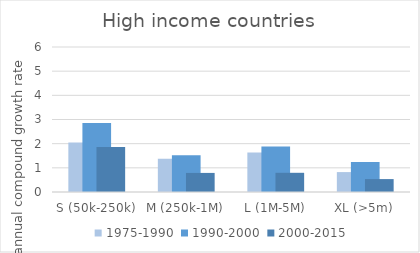
| Category | 1975-1990 | 1990-2000 | 2000-2015 |
|---|---|---|---|
| S (50k-250k) | 2.044 | 2.855 | 1.863 |
| M (250k-1M) | 1.375 | 1.523 | 0.79 |
| L (1M-5M) | 1.634 | 1.884 | 0.795 |
| XL (>5m) | 0.824 | 1.242 | 0.534 |